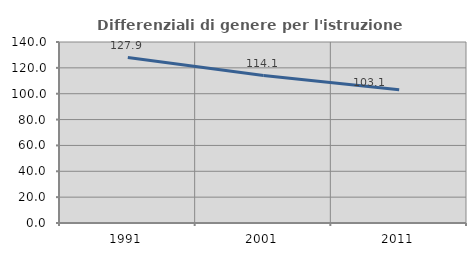
| Category | Differenziali di genere per l'istruzione superiore |
|---|---|
| 1991.0 | 127.934 |
| 2001.0 | 114.088 |
| 2011.0 | 103.072 |